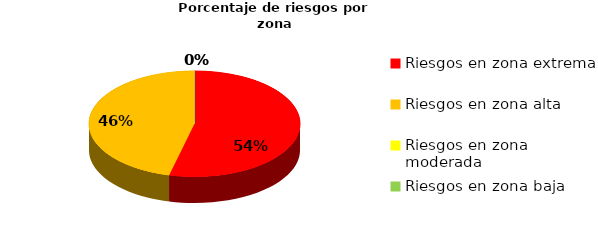
| Category | Series 0 | Series 1 |
|---|---|---|
| Riesgos en zona extrema | 7 | 0.538 |
| Riesgos en zona alta | 6 | 0.462 |
| Riesgos en zona moderada | 0 | 0 |
| Riesgos en zona baja | 0 | 0 |